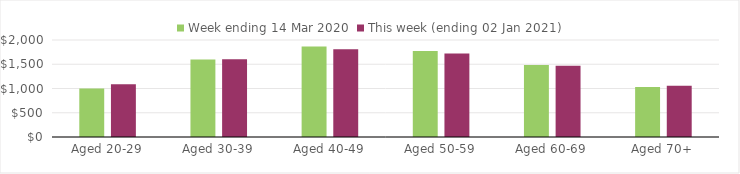
| Category | Week ending 14 Mar 2020 | This week (ending 02 Jan 2021) |
|---|---|---|
| Aged 20-29 | 1000.57 | 1090.16 |
| Aged 30-39 | 1596.64 | 1601.08 |
| Aged 40-49 | 1865.73 | 1808.27 |
| Aged 50-59 | 1773.92 | 1721.69 |
| Aged 60-69 | 1483.12 | 1470.94 |
| Aged 70+ | 1033.21 | 1058.8 |